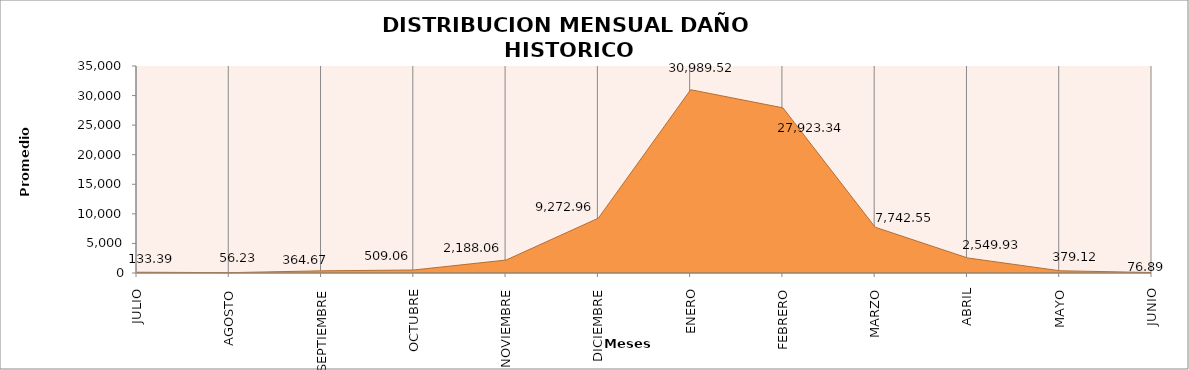
| Category | JULIO AGOSTO SEPTIEMBRE OCTUBRE NOVIEMBRE DICIEMBRE ENERO FEBRERO MARZO ABRIL MAYO JUNIO |
|---|---|
| JULIO | 133.387 |
| AGOSTO | 56.233 |
| SEPTIEMBRE | 364.665 |
| OCTUBRE | 509.057 |
| NOVIEMBRE | 2188.062 |
| DICIEMBRE | 9272.96 |
| ENERO | 30989.516 |
| FEBRERO | 27923.339 |
| MARZO | 7742.546 |
| ABRIL | 2549.926 |
| MAYO | 379.123 |
| JUNIO | 76.885 |